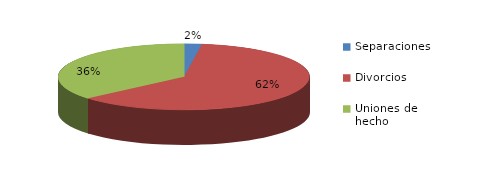
| Category | Series 0 |
|---|---|
| Separaciones | 6 |
| Divorcios | 163 |
| Uniones de hecho | 96 |